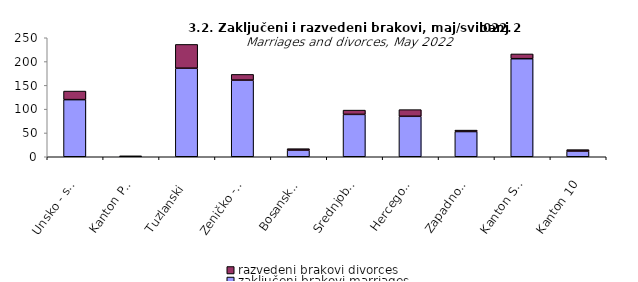
| Category | zaključeni brakovi marriages | razvedeni brakovi divorces |
|---|---|---|
| Unsko - sanski | 120 | 18 |
| Kanton Posavski | 2 | 0 |
| Tuzlanski | 186 | 50 |
| Zeničko - dobojski | 161 | 12 |
| Bosansko - podrinjski | 14 | 3 |
| Srednjobosanski | 89 | 9 |
| Hercegovačko-neretvanski | 85 | 14 |
| Zapadnohercegovački | 53 | 3 |
| Kanton Sarajevo | 206 | 10 |
| Kanton 10 | 12 | 3 |